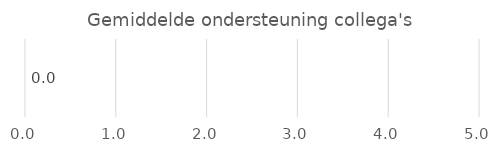
| Category | Series 0 |
|---|---|
| Ondersteuning collega's | 0 |